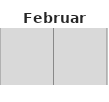
| Category | 1 | Fill 1 | 2 | Fill 2 | 3 | Fill 3 | 4 | Fill 4 | 5 | Fill 5 | 6 | Fill 6 | 7 | Fill 7 | 8 | Fill 8 | 9 | Fill 9 | 10 | Fill 10 | 11 | Fill 11 | 12 | Fill 12 | 13 | Fill 13 | 14 | Fill 14 | 15 | Fill 15 | 16 | Fill 16 | 17 | Fill 17 | 18 | Fill 18 | 19 | Fill 19 | 20 | Fill 20 | 21 | Fill 21 | 22 | Fill 22 | 23 | Fill 23 | 24 | Fill 24 | 25 | Fill 25 | 26 | Fill 26 | 27 | Fill 27 | 28 | Fill 28 |
|---|---|---|---|---|---|---|---|---|---|---|---|---|---|---|---|---|---|---|---|---|---|---|---|---|---|---|---|---|---|---|---|---|---|---|---|---|---|---|---|---|---|---|---|---|---|---|---|---|---|---|---|---|---|---|---|---|
| STSH | 0 | 1 | 0 | 1 | 0 | 1 | 0 | 1 | 0 | 1 | 0 | 1 | 0 | 1 | 0 | 1 | 0 | 1 | 0 | 1 | 0 | 1 | 0 | 1 | 0 | 1 | 0 | 1 | 0 | 1 | 0 | 1 | 0 | 1 | 0 | 1 | 0 | 1 | 0 | 1 | 0 | 1 | 0 | 1 | 0 | 1 | 0 | 1 | 0 | 1 | 0 | 1 | 0 | 1 | 0 | 1 |